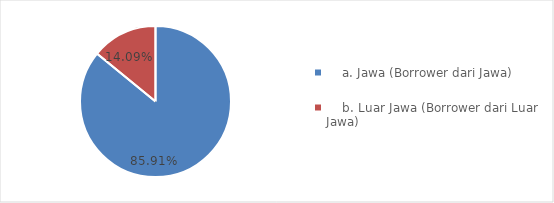
| Category | Series 0 |
|---|---|
|     a. Jawa (Borrower dari Jawa) | 31799667116662.273 |
|     b. Luar Jawa (Borrower dari Luar Jawa) | 5213726391282.216 |